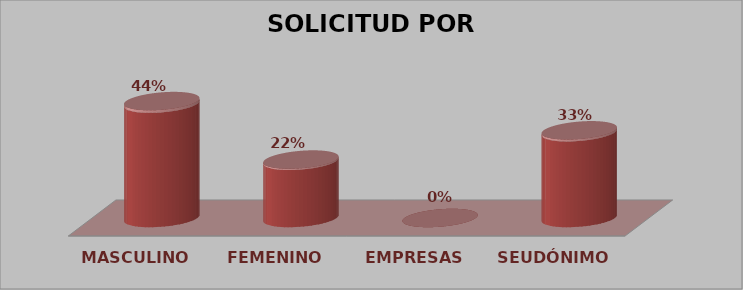
| Category | SOLICITUD POR GÉNERO | Series 1 |
|---|---|---|
| MASCULINO | 20 | 0.444 |
| FEMENINO | 10 | 0.222 |
| EMPRESAS | 0 | 0 |
| SEUDÓNIMO | 15 | 0.333 |